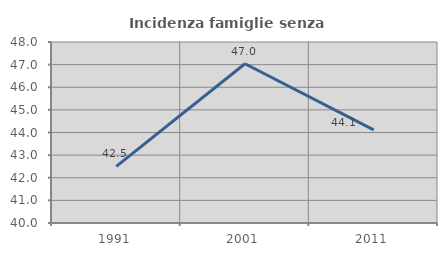
| Category | Incidenza famiglie senza nuclei |
|---|---|
| 1991.0 | 42.5 |
| 2001.0 | 47.037 |
| 2011.0 | 44.118 |